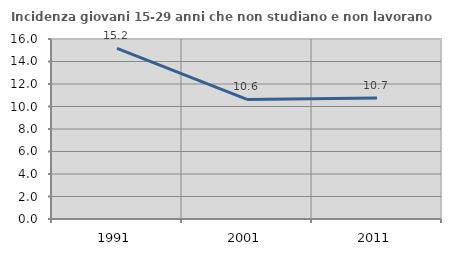
| Category | Incidenza giovani 15-29 anni che non studiano e non lavorano  |
|---|---|
| 1991.0 | 15.172 |
| 2001.0 | 10.63 |
| 2011.0 | 10.748 |